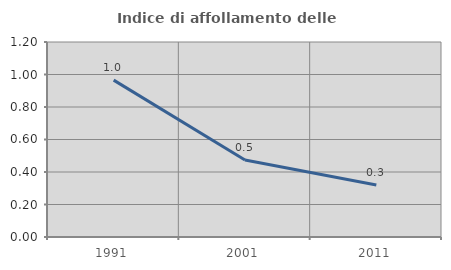
| Category | Indice di affollamento delle abitazioni  |
|---|---|
| 1991.0 | 0.966 |
| 2001.0 | 0.474 |
| 2011.0 | 0.32 |